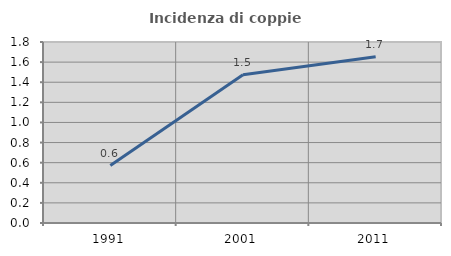
| Category | Incidenza di coppie miste |
|---|---|
| 1991.0 | 0.571 |
| 2001.0 | 1.475 |
| 2011.0 | 1.654 |